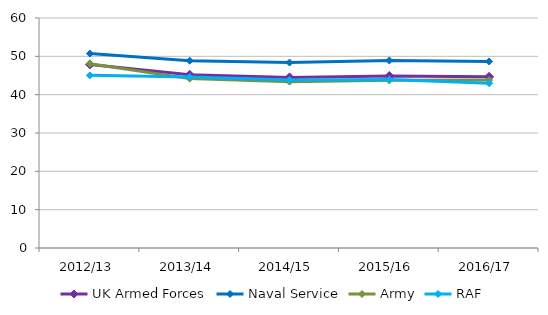
| Category | UK Armed Forces | Naval Service | Army | RAF |
|---|---|---|---|---|
| 2012/13 | 47.899 | 50.718 | 48.066 | 45.039 |
| 2013/14 | 45.2 | 48.862 | 44.186 | 44.609 |
| 2014/15 | 44.503 | 48.381 | 43.392 | 43.826 |
| 2015/16 | 44.875 | 48.924 | 43.744 | 43.935 |
| 2016/17 | 44.652 | 48.666 | 43.803 | 42.993 |